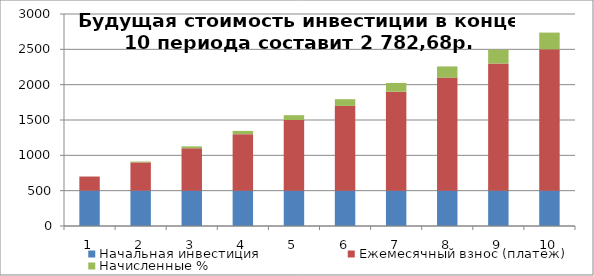
| Category | Начальная инвестиция | Ежемесячный взнос (платеж) | Начисленные % |
|---|---|---|---|
| 0 | 500 | 200 | 0 |
| 1 | 500 | 400 | 11.667 |
| 2 | 500 | 600 | 26.861 |
| 3 | 500 | 800 | 45.642 |
| 4 | 500 | 1000 | 68.069 |
| 5 | 500 | 1200 | 94.204 |
| 6 | 500 | 1400 | 124.107 |
| 7 | 500 | 1600 | 157.843 |
| 8 | 500 | 1800 | 195.473 |
| 9 | 500 | 2000 | 237.064 |